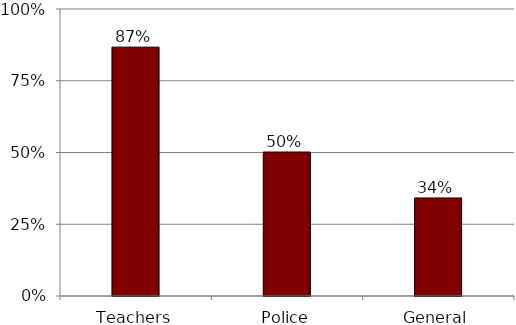
| Category | Series 0 |
|---|---|
| Teachers | 0.867 |
| Police | 0.502 |
| General | 0.342 |